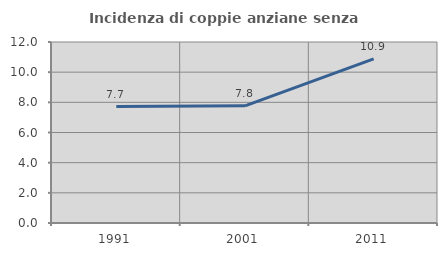
| Category | Incidenza di coppie anziane senza figli  |
|---|---|
| 1991.0 | 7.718 |
| 2001.0 | 7.767 |
| 2011.0 | 10.884 |